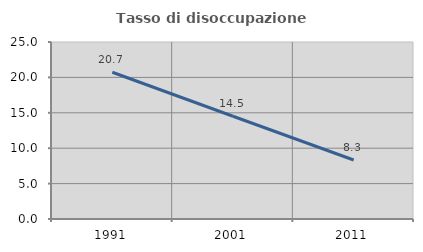
| Category | Tasso di disoccupazione giovanile  |
|---|---|
| 1991.0 | 20.732 |
| 2001.0 | 14.516 |
| 2011.0 | 8.333 |